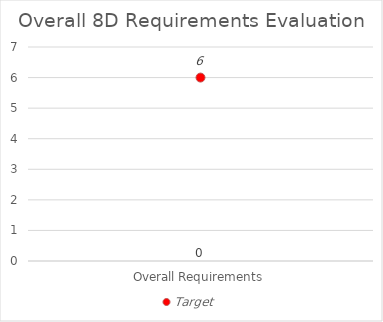
| Category | 8D Evaluation |
|---|---|
| Overall Requirements | 0 |